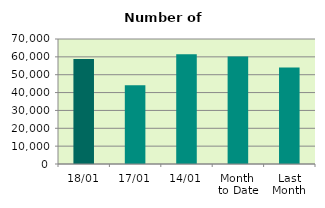
| Category | Series 0 |
|---|---|
| 18/01 | 58856 |
| 17/01 | 44138 |
| 14/01 | 61518 |
| Month 
to Date | 60263.273 |
| Last
Month | 53997.143 |